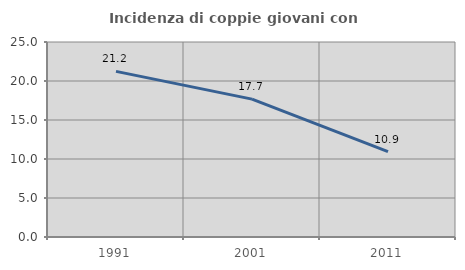
| Category | Incidenza di coppie giovani con figli |
|---|---|
| 1991.0 | 21.237 |
| 2001.0 | 17.678 |
| 2011.0 | 10.942 |